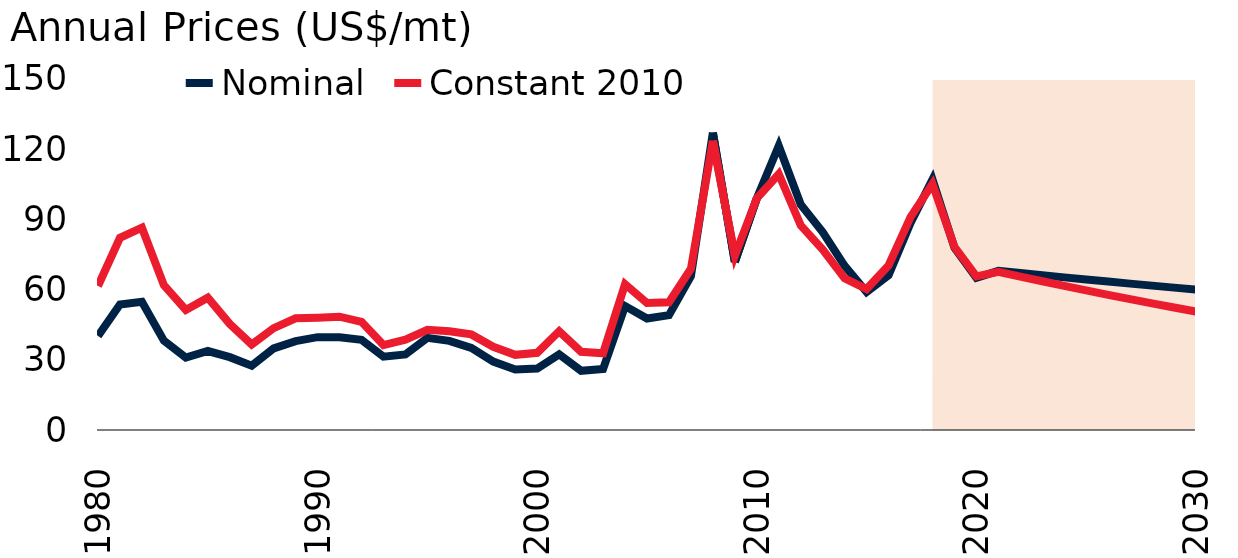
| Category | Nominal | Constant 2010 |
|---|---|---|
| 1980.0 | 40.141 | 61.543 |
| 1981.0 | 53.62 | 82.115 |
| 1982.0 | 54.768 | 86.447 |
| 1983.0 | 38.188 | 61.918 |
| 1984.0 | 30.958 | 51.326 |
| 1985.0 | 33.75 | 56.544 |
| 1986.0 | 31.125 | 45.338 |
| 1987.0 | 27.5 | 36.554 |
| 1988.0 | 34.875 | 43.532 |
| 1989.0 | 38 | 47.719 |
| 1990.0 | 39.667 | 47.981 |
| 1991.0 | 39.667 | 48.426 |
| 1992.0 | 38.562 | 46.214 |
| 1993.0 | 31.333 | 36.298 |
| 1994.0 | 32.3 | 38.576 |
| 1995.0 | 39.372 | 42.833 |
| 1996.0 | 38.074 | 42.226 |
| 1997.0 | 35.099 | 40.85 |
| 1998.0 | 29.231 | 35.573 |
| 1999.0 | 25.892 | 32.127 |
| 2000.0 | 26.25 | 32.994 |
| 2001.0 | 32.312 | 42.196 |
| 2002.0 | 25.309 | 33.441 |
| 2003.0 | 26.091 | 32.77 |
| 2004.0 | 52.948 | 62.273 |
| 2005.0 | 47.621 | 54.297 |
| 2006.0 | 49.09 | 54.589 |
| 2007.0 | 65.733 | 68.881 |
| 2008.0 | 127.104 | 123.601 |
| 2009.0 | 71.844 | 74.479 |
| 2010.0 | 98.966 | 98.966 |
| 2011.0 | 121.448 | 109.417 |
| 2012.0 | 96.364 | 87.465 |
| 2013.0 | 84.562 | 77.089 |
| 2014.0 | 70.13 | 64.805 |
| 2015.0 | 58.939 | 60.229 |
| 2016.0 | 66.123 | 70.319 |
| 2017.0 | 88.518 | 90.955 |
| 2018.0 | 107.022 | 105.151 |
| 2019.0 | 77.886 | 78.295 |
| 2020.0 | 65 | 65.664 |
| 2021.0 | 68 | 67.614 |
| 2022.0 | 67.061 | 65.581 |
| 2023.0 | 66.135 | 63.573 |
| 2024.0 | 65.221 | 61.596 |
| 2025.0 | 64.321 | 59.658 |
| 2026.0 | 63.432 | 57.76 |
| 2027.0 | 62.556 | 55.905 |
| 2028.0 | 61.692 | 54.095 |
| 2029.0 | 60.84 | 52.329 |
| 2030.0 | 60 | 50.607 |